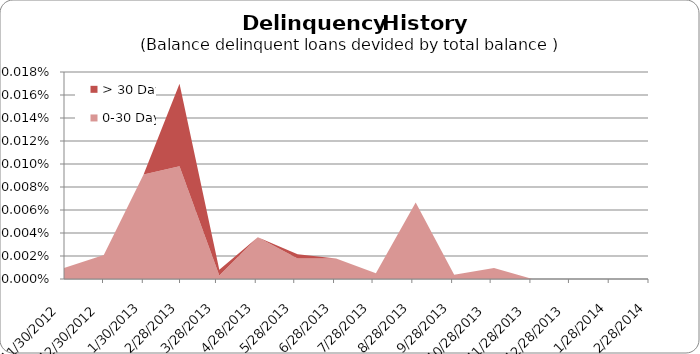
| Category | 0-30 Days | > 30 Days |
|---|---|---|
| 11/30/12 | 0 | 0 |
| 12/31/12 | 0 | 0 |
| 1/31/13 | 0 | 0 |
| 2/28/13 | 0 | 0 |
| 3/31/13 | 0 | 0 |
| 4/30/13 | 0 | 0 |
| 5/31/13 | 0 | 0 |
| 6/30/13 | 0 | 0 |
| 7/31/13 | 0 | 0 |
| 8/31/13 | 0 | 0 |
| 9/30/13 | 0 | 0 |
| 10/31/13 | 0 | 0 |
| 11/30/13 | 0 | 0 |
| 12/31/13 | 0 | 0 |
| 1/31/14 | 0 | 0 |
| 2/28/14 | 0 | 0 |